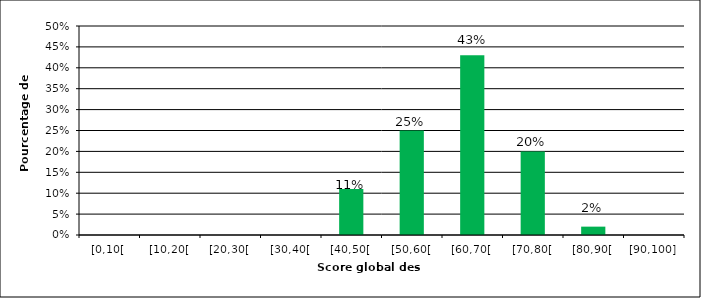
| Category | Series 0 | Series 1 |
|---|---|---|
| [0,10[ |  | 0 |
| [10,20[ |  | 0 |
| [20,30[ |  | 0 |
| [30,40[ |  | 0 |
| [40,50[ |  | 0.11 |
| [50,60[ |  | 0.25 |
| [60,70[ |  | 0.43 |
| [70,80[ |  | 0.2 |
| [80,90[ |  | 0.02 |
| [90,100] |  | 0 |